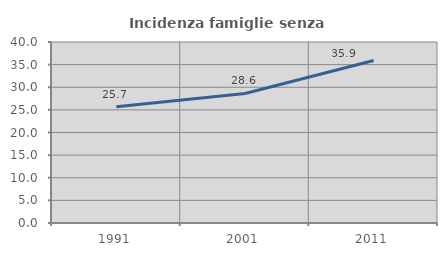
| Category | Incidenza famiglie senza nuclei |
|---|---|
| 1991.0 | 25.678 |
| 2001.0 | 28.628 |
| 2011.0 | 35.926 |